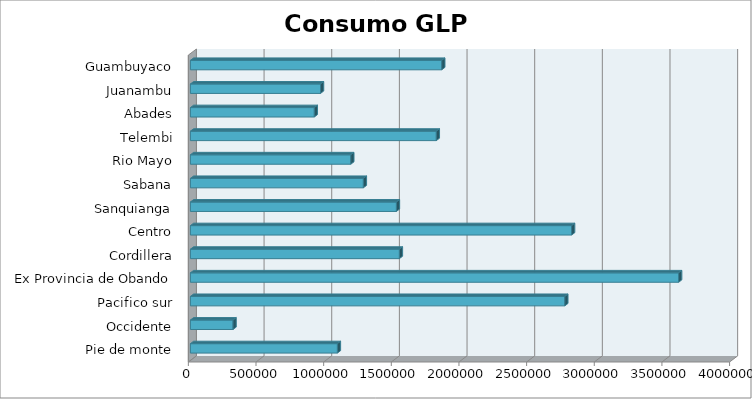
| Category | Series 0 |
|---|---|
| Pie de monte | 1086479.966 |
| Occidente | 315148.832 |
| Pacifico sur | 2767169.347 |
| Ex Provincia de Obando | 3608464.119 |
| Cordillera | 1544702.596 |
| Centro | 2817503.595 |
| Sanquianga | 1522673.038 |
| Sabana | 1278343.439 |
| Rio Mayo | 1185384.773 |
| Telembi | 1817583.687 |
| Abades | 915797.092 |
| Juanambu | 961888.839 |
| Guambuyaco | 1857600.741 |